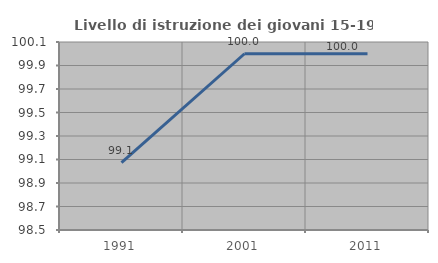
| Category | Livello di istruzione dei giovani 15-19 anni |
|---|---|
| 1991.0 | 99.074 |
| 2001.0 | 100 |
| 2011.0 | 100 |